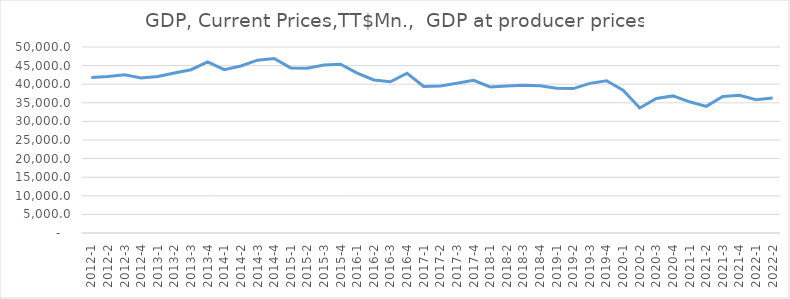
| Category | Series 0 |
|---|---|
| 2012-1 | 41803.254 |
| 2012-2 | 42060.203 |
| 2012-3 | 42531.803 |
| 2012-4 | 41647.376 |
| 2013-1 | 42095.58 |
| 2013-2 | 43014.53 |
| 2013-3 | 43891.777 |
| 2013-4 | 45993.853 |
| 2014-1 | 43919.127 |
| 2014-2 | 44898.647 |
| 2014-3 | 46467.91 |
| 2014-4 | 46894.307 |
| 2015-1 | 44382.806 |
| 2015-2 | 44274.284 |
| 2015-3 | 45130.076 |
| 2015-4 | 45381.15 |
| 2016-1 | 42982.994 |
| 2016-2 | 41133.359 |
| 2016-3 | 40662.949 |
| 2016-4 | 42941.724 |
| 2017-1 | 39393.122 |
| 2017-2 | 39489.997 |
| 2017-3 | 40229.134 |
| 2017-4 | 41048.907 |
| 2018-1 | 39250.752 |
| 2018-2 | 39523.008 |
| 2018-3 | 39713.511 |
| 2018-4 | 39590.366 |
| 2019-1 | 38940.055 |
| 2019-2 | 38826.177 |
| 2019-3 | 40219.916 |
| 2019-4 | 40926.129 |
| 2020-1 | 38382.792 |
| 2020-2 | 33608.849 |
| 2020-3 | 36165.412 |
| 2020-4 | 36854.344 |
| 2021-1 | 35264.091 |
| 2021-2 | 34040.964 |
| 2021-3 | 36707.046 |
| 2021-4 | 37005.54 |
| 2022-1 | 35835.608 |
| 2022-2 | 36280.568 |